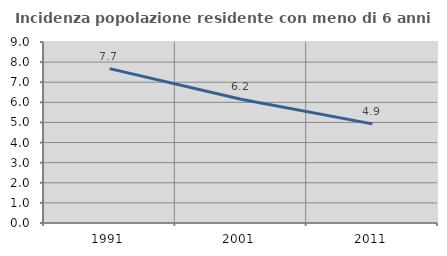
| Category | Incidenza popolazione residente con meno di 6 anni |
|---|---|
| 1991.0 | 7.675 |
| 2001.0 | 6.151 |
| 2011.0 | 4.93 |